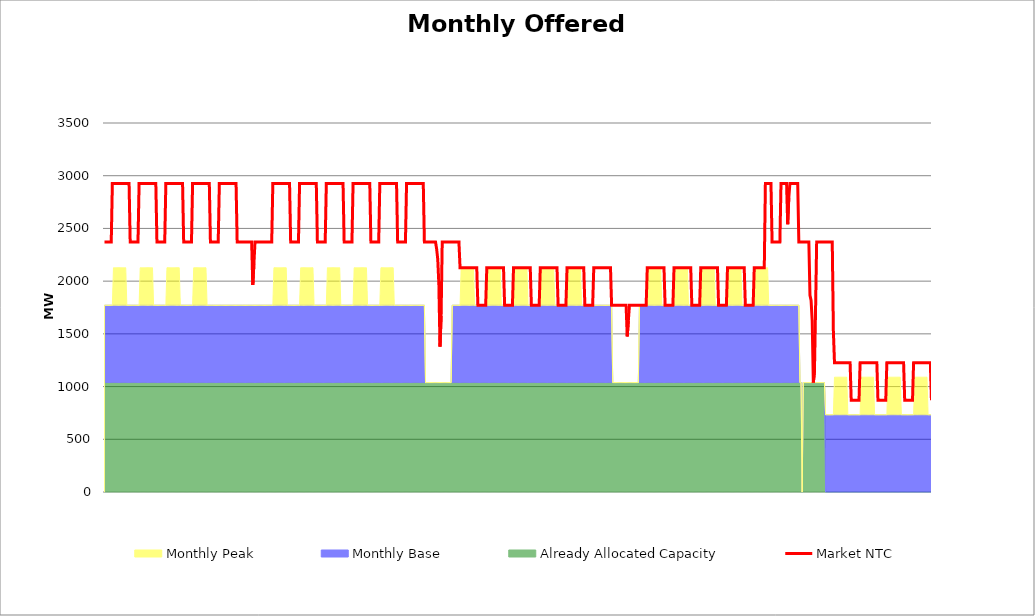
| Category | Market NTC |
|---|---|
| 0 | 2371 |
| 1 | 2371 |
| 2 | 2371 |
| 3 | 2371 |
| 4 | 2371 |
| 5 | 2371 |
| 6 | 2371 |
| 7 | 2927 |
| 8 | 2927 |
| 9 | 2927 |
| 10 | 2927 |
| 11 | 2927 |
| 12 | 2927 |
| 13 | 2927 |
| 14 | 2927 |
| 15 | 2927 |
| 16 | 2927 |
| 17 | 2927 |
| 18 | 2927 |
| 19 | 2927 |
| 20 | 2927 |
| 21 | 2927 |
| 22 | 2927 |
| 23 | 2371 |
| 24 | 2371 |
| 25 | 2371 |
| 26 | 2371 |
| 27 | 2371 |
| 28 | 2371 |
| 29 | 2371 |
| 30 | 2371 |
| 31 | 2927 |
| 32 | 2927 |
| 33 | 2927 |
| 34 | 2927 |
| 35 | 2927 |
| 36 | 2927 |
| 37 | 2927 |
| 38 | 2927 |
| 39 | 2927 |
| 40 | 2927 |
| 41 | 2927 |
| 42 | 2927 |
| 43 | 2927 |
| 44 | 2927 |
| 45 | 2927 |
| 46 | 2927 |
| 47 | 2371 |
| 48 | 2371 |
| 49 | 2371 |
| 50 | 2371 |
| 51 | 2371 |
| 52 | 2371 |
| 53 | 2371 |
| 54 | 2371 |
| 55 | 2927 |
| 56 | 2927 |
| 57 | 2927 |
| 58 | 2927 |
| 59 | 2927 |
| 60 | 2927 |
| 61 | 2927 |
| 62 | 2927 |
| 63 | 2927 |
| 64 | 2927 |
| 65 | 2927 |
| 66 | 2927 |
| 67 | 2927 |
| 68 | 2927 |
| 69 | 2927 |
| 70 | 2927 |
| 71 | 2371 |
| 72 | 2371 |
| 73 | 2371 |
| 74 | 2371 |
| 75 | 2371 |
| 76 | 2371 |
| 77 | 2371 |
| 78 | 2371 |
| 79 | 2927 |
| 80 | 2927 |
| 81 | 2927 |
| 82 | 2927 |
| 83 | 2927 |
| 84 | 2927 |
| 85 | 2927 |
| 86 | 2927 |
| 87 | 2927 |
| 88 | 2927 |
| 89 | 2927 |
| 90 | 2927 |
| 91 | 2927 |
| 92 | 2927 |
| 93 | 2927 |
| 94 | 2927 |
| 95 | 2371 |
| 96 | 2371 |
| 97 | 2371 |
| 98 | 2371 |
| 99 | 2371 |
| 100 | 2371 |
| 101 | 2371 |
| 102 | 2371 |
| 103 | 2927 |
| 104 | 2927 |
| 105 | 2927 |
| 106 | 2927 |
| 107 | 2927 |
| 108 | 2927 |
| 109 | 2927 |
| 110 | 2927 |
| 111 | 2927 |
| 112 | 2927 |
| 113 | 2927 |
| 114 | 2927 |
| 115 | 2927 |
| 116 | 2927 |
| 117 | 2927 |
| 118 | 2927 |
| 119 | 2371 |
| 120 | 2371 |
| 121 | 2371 |
| 122 | 2371 |
| 123 | 2371 |
| 124 | 2371 |
| 125 | 2371 |
| 126 | 2371 |
| 127 | 2371 |
| 128 | 2371 |
| 129 | 2371 |
| 130 | 2371 |
| 131 | 2371 |
| 132 | 2371 |
| 133 | 1963 |
| 134 | 2158 |
| 135 | 2371 |
| 136 | 2371 |
| 137 | 2371 |
| 138 | 2371 |
| 139 | 2371 |
| 140 | 2371 |
| 141 | 2371 |
| 142 | 2371 |
| 143 | 2371 |
| 144 | 2371 |
| 145 | 2371 |
| 146 | 2371 |
| 147 | 2371 |
| 148 | 2371 |
| 149 | 2371 |
| 150 | 2371 |
| 151 | 2927 |
| 152 | 2927 |
| 153 | 2927 |
| 154 | 2927 |
| 155 | 2927 |
| 156 | 2927 |
| 157 | 2927 |
| 158 | 2927 |
| 159 | 2927 |
| 160 | 2927 |
| 161 | 2927 |
| 162 | 2927 |
| 163 | 2927 |
| 164 | 2927 |
| 165 | 2927 |
| 166 | 2927 |
| 167 | 2371 |
| 168 | 2371 |
| 169 | 2371 |
| 170 | 2371 |
| 171 | 2371 |
| 172 | 2371 |
| 173 | 2371 |
| 174 | 2371 |
| 175 | 2927 |
| 176 | 2927 |
| 177 | 2927 |
| 178 | 2927 |
| 179 | 2927 |
| 180 | 2927 |
| 181 | 2927 |
| 182 | 2927 |
| 183 | 2927 |
| 184 | 2927 |
| 185 | 2927 |
| 186 | 2927 |
| 187 | 2927 |
| 188 | 2927 |
| 189 | 2927 |
| 190 | 2927 |
| 191 | 2371 |
| 192 | 2371 |
| 193 | 2371 |
| 194 | 2371 |
| 195 | 2371 |
| 196 | 2371 |
| 197 | 2371 |
| 198 | 2371 |
| 199 | 2927 |
| 200 | 2927 |
| 201 | 2927 |
| 202 | 2927 |
| 203 | 2927 |
| 204 | 2927 |
| 205 | 2927 |
| 206 | 2927 |
| 207 | 2927 |
| 208 | 2927 |
| 209 | 2927 |
| 210 | 2927 |
| 211 | 2927 |
| 212 | 2927 |
| 213 | 2927 |
| 214 | 2927 |
| 215 | 2371 |
| 216 | 2371 |
| 217 | 2371 |
| 218 | 2371 |
| 219 | 2371 |
| 220 | 2371 |
| 221 | 2371 |
| 222 | 2371 |
| 223 | 2927 |
| 224 | 2927 |
| 225 | 2927 |
| 226 | 2927 |
| 227 | 2927 |
| 228 | 2927 |
| 229 | 2927 |
| 230 | 2927 |
| 231 | 2927 |
| 232 | 2927 |
| 233 | 2927 |
| 234 | 2927 |
| 235 | 2927 |
| 236 | 2927 |
| 237 | 2927 |
| 238 | 2927 |
| 239 | 2371 |
| 240 | 2371 |
| 241 | 2371 |
| 242 | 2371 |
| 243 | 2371 |
| 244 | 2371 |
| 245 | 2371 |
| 246 | 2371 |
| 247 | 2927 |
| 248 | 2927 |
| 249 | 2927 |
| 250 | 2927 |
| 251 | 2927 |
| 252 | 2927 |
| 253 | 2927 |
| 254 | 2927 |
| 255 | 2927 |
| 256 | 2927 |
| 257 | 2927 |
| 258 | 2927 |
| 259 | 2927 |
| 260 | 2927 |
| 261 | 2927 |
| 262 | 2927 |
| 263 | 2371 |
| 264 | 2371 |
| 265 | 2371 |
| 266 | 2371 |
| 267 | 2371 |
| 268 | 2371 |
| 269 | 2371 |
| 270 | 2371 |
| 271 | 2927 |
| 272 | 2927 |
| 273 | 2927 |
| 274 | 2927 |
| 275 | 2927 |
| 276 | 2927 |
| 277 | 2927 |
| 278 | 2927 |
| 279 | 2927 |
| 280 | 2927 |
| 281 | 2927 |
| 282 | 2927 |
| 283 | 2927 |
| 284 | 2927 |
| 285 | 2927 |
| 286 | 2927 |
| 287 | 2371 |
| 288 | 2371 |
| 289 | 2371 |
| 290 | 2371 |
| 291 | 2371 |
| 292 | 2371 |
| 293 | 2371 |
| 294 | 2371 |
| 295 | 2371 |
| 296 | 2371 |
| 297 | 2371 |
| 298 | 2304 |
| 299 | 2207 |
| 300 | 1963 |
| 301 | 1379 |
| 302 | 1671 |
| 303 | 2371 |
| 304 | 2371 |
| 305 | 2371 |
| 306 | 2371 |
| 307 | 2371 |
| 308 | 2371 |
| 309 | 2371 |
| 310 | 2371 |
| 311 | 2371 |
| 312 | 2371 |
| 313 | 2371 |
| 314 | 2371 |
| 315 | 2371 |
| 316 | 2371 |
| 317 | 2371 |
| 318 | 2371 |
| 319 | 2127 |
| 320 | 2127 |
| 321 | 2127 |
| 322 | 2127 |
| 323 | 2127 |
| 324 | 2127 |
| 325 | 2127 |
| 326 | 2127 |
| 327 | 2127 |
| 328 | 2127 |
| 329 | 2127 |
| 330 | 2127 |
| 331 | 2127 |
| 332 | 2127 |
| 333 | 2127 |
| 334 | 2127 |
| 335 | 1771 |
| 336 | 1771 |
| 337 | 1771 |
| 338 | 1771 |
| 339 | 1771 |
| 340 | 1771 |
| 341 | 1771 |
| 342 | 1771 |
| 343 | 2127 |
| 344 | 2127 |
| 345 | 2127 |
| 346 | 2127 |
| 347 | 2127 |
| 348 | 2127 |
| 349 | 2127 |
| 350 | 2127 |
| 351 | 2127 |
| 352 | 2127 |
| 353 | 2127 |
| 354 | 2127 |
| 355 | 2127 |
| 356 | 2127 |
| 357 | 2127 |
| 358 | 2127 |
| 359 | 1771 |
| 360 | 1771 |
| 361 | 1771 |
| 362 | 1771 |
| 363 | 1771 |
| 364 | 1771 |
| 365 | 1771 |
| 366 | 1771 |
| 367 | 2127 |
| 368 | 2127 |
| 369 | 2127 |
| 370 | 2127 |
| 371 | 2127 |
| 372 | 2127 |
| 373 | 2127 |
| 374 | 2127 |
| 375 | 2127 |
| 376 | 2127 |
| 377 | 2127 |
| 378 | 2127 |
| 379 | 2127 |
| 380 | 2127 |
| 381 | 2127 |
| 382 | 2127 |
| 383 | 1771 |
| 384 | 1771 |
| 385 | 1771 |
| 386 | 1771 |
| 387 | 1771 |
| 388 | 1771 |
| 389 | 1771 |
| 390 | 1771 |
| 391 | 2127 |
| 392 | 2127 |
| 393 | 2127 |
| 394 | 2127 |
| 395 | 2127 |
| 396 | 2127 |
| 397 | 2127 |
| 398 | 2127 |
| 399 | 2127 |
| 400 | 2127 |
| 401 | 2127 |
| 402 | 2127 |
| 403 | 2127 |
| 404 | 2127 |
| 405 | 2127 |
| 406 | 2127 |
| 407 | 1771 |
| 408 | 1771 |
| 409 | 1771 |
| 410 | 1771 |
| 411 | 1771 |
| 412 | 1771 |
| 413 | 1771 |
| 414 | 1771 |
| 415 | 2127 |
| 416 | 2127 |
| 417 | 2127 |
| 418 | 2127 |
| 419 | 2127 |
| 420 | 2127 |
| 421 | 2127 |
| 422 | 2127 |
| 423 | 2127 |
| 424 | 2127 |
| 425 | 2127 |
| 426 | 2127 |
| 427 | 2127 |
| 428 | 2127 |
| 429 | 2127 |
| 430 | 2127 |
| 431 | 1771 |
| 432 | 1771 |
| 433 | 1771 |
| 434 | 1771 |
| 435 | 1771 |
| 436 | 1771 |
| 437 | 1771 |
| 438 | 1771 |
| 439 | 2127 |
| 440 | 2127 |
| 441 | 2127 |
| 442 | 2127 |
| 443 | 2127 |
| 444 | 2127 |
| 445 | 2127 |
| 446 | 2127 |
| 447 | 2127 |
| 448 | 2127 |
| 449 | 2127 |
| 450 | 2127 |
| 451 | 2127 |
| 452 | 2127 |
| 453 | 2127 |
| 454 | 2127 |
| 455 | 1771 |
| 456 | 1771 |
| 457 | 1771 |
| 458 | 1771 |
| 459 | 1771 |
| 460 | 1771 |
| 461 | 1771 |
| 462 | 1771 |
| 463 | 1771 |
| 464 | 1771 |
| 465 | 1771 |
| 466 | 1771 |
| 467 | 1771 |
| 468 | 1771 |
| 469 | 1476 |
| 470 | 1623 |
| 471 | 1771 |
| 472 | 1771 |
| 473 | 1771 |
| 474 | 1771 |
| 475 | 1771 |
| 476 | 1771 |
| 477 | 1771 |
| 478 | 1771 |
| 479 | 1771 |
| 480 | 1771 |
| 481 | 1771 |
| 482 | 1771 |
| 483 | 1771 |
| 484 | 1771 |
| 485 | 1771 |
| 486 | 1771 |
| 487 | 2127 |
| 488 | 2127 |
| 489 | 2127 |
| 490 | 2127 |
| 491 | 2127 |
| 492 | 2127 |
| 493 | 2127 |
| 494 | 2127 |
| 495 | 2127 |
| 496 | 2127 |
| 497 | 2127 |
| 498 | 2127 |
| 499 | 2127 |
| 500 | 2127 |
| 501 | 2127 |
| 502 | 2127 |
| 503 | 1771 |
| 504 | 1771 |
| 505 | 1771 |
| 506 | 1771 |
| 507 | 1771 |
| 508 | 1771 |
| 509 | 1771 |
| 510 | 1771 |
| 511 | 2127 |
| 512 | 2127 |
| 513 | 2127 |
| 514 | 2127 |
| 515 | 2127 |
| 516 | 2127 |
| 517 | 2127 |
| 518 | 2127 |
| 519 | 2127 |
| 520 | 2127 |
| 521 | 2127 |
| 522 | 2127 |
| 523 | 2127 |
| 524 | 2127 |
| 525 | 2127 |
| 526 | 2127 |
| 527 | 1771 |
| 528 | 1771 |
| 529 | 1771 |
| 530 | 1771 |
| 531 | 1771 |
| 532 | 1771 |
| 533 | 1771 |
| 534 | 1771 |
| 535 | 2127 |
| 536 | 2127 |
| 537 | 2127 |
| 538 | 2127 |
| 539 | 2127 |
| 540 | 2127 |
| 541 | 2127 |
| 542 | 2127 |
| 543 | 2127 |
| 544 | 2127 |
| 545 | 2127 |
| 546 | 2127 |
| 547 | 2127 |
| 548 | 2127 |
| 549 | 2127 |
| 550 | 2127 |
| 551 | 1771 |
| 552 | 1771 |
| 553 | 1771 |
| 554 | 1771 |
| 555 | 1771 |
| 556 | 1771 |
| 557 | 1771 |
| 558 | 1771 |
| 559 | 2127 |
| 560 | 2127 |
| 561 | 2127 |
| 562 | 2127 |
| 563 | 2127 |
| 564 | 2127 |
| 565 | 2127 |
| 566 | 2127 |
| 567 | 2127 |
| 568 | 2127 |
| 569 | 2127 |
| 570 | 2127 |
| 571 | 2127 |
| 572 | 2127 |
| 573 | 2127 |
| 574 | 2127 |
| 575 | 1771 |
| 576 | 1771 |
| 577 | 1771 |
| 578 | 1771 |
| 579 | 1771 |
| 580 | 1771 |
| 581 | 1771 |
| 582 | 1771 |
| 583 | 2127 |
| 584 | 2127 |
| 585 | 2127 |
| 586 | 2127 |
| 587 | 2127 |
| 588 | 2127 |
| 589 | 2127 |
| 590 | 2127 |
| 591 | 2127 |
| 592 | 2127 |
| 593 | 2927 |
| 594 | 2927 |
| 595 | 2927 |
| 596 | 2927 |
| 597 | 2927 |
| 598 | 2927 |
| 599 | 2371 |
| 600 | 2371 |
| 601 | 2371 |
| 602 | 2371 |
| 603 | 2371 |
| 604 | 2371 |
| 605 | 2371 |
| 606 | 2371 |
| 607 | 2927 |
| 608 | 2927 |
| 609 | 2927 |
| 610 | 2927 |
| 611 | 2927 |
| 612 | 2927 |
| 613 | 2540 |
| 614 | 2792 |
| 615 | 2927 |
| 616 | 2927 |
| 617 | 2927 |
| 618 | 2927 |
| 619 | 2927 |
| 620 | 2927 |
| 621 | 2927 |
| 622 | 2927 |
| 623 | 2371 |
| 624 | 2371 |
| 625 | 2371 |
| 626 | 2371 |
| 627 | 2371 |
| 628 | 2371 |
| 629 | 2371 |
| 630 | 2371 |
| 631 | 2371 |
| 632 | 2371 |
| 633 | 1866 |
| 634 | 1817 |
| 635 | 1623 |
| 636 | 1038 |
| 637 | 1136 |
| 638 | 1720 |
| 639 | 2371 |
| 640 | 2371 |
| 641 | 2371 |
| 642 | 2371 |
| 643 | 2371 |
| 644 | 2371 |
| 645 | 2371 |
| 646 | 2371 |
| 647 | 2371 |
| 648 | 2371 |
| 649 | 2371 |
| 650 | 2371 |
| 651 | 2371 |
| 652 | 2371 |
| 653 | 2371 |
| 654 | 1527 |
| 655 | 1227 |
| 656 | 1227 |
| 657 | 1227 |
| 658 | 1227 |
| 659 | 1227 |
| 660 | 1227 |
| 661 | 1227 |
| 662 | 1227 |
| 663 | 1227 |
| 664 | 1227 |
| 665 | 1227 |
| 666 | 1227 |
| 667 | 1227 |
| 668 | 1227 |
| 669 | 1227 |
| 670 | 871 |
| 671 | 871 |
| 672 | 871 |
| 673 | 871 |
| 674 | 871 |
| 675 | 871 |
| 676 | 871 |
| 677 | 871 |
| 678 | 1227 |
| 679 | 1227 |
| 680 | 1227 |
| 681 | 1227 |
| 682 | 1227 |
| 683 | 1227 |
| 684 | 1227 |
| 685 | 1227 |
| 686 | 1227 |
| 687 | 1227 |
| 688 | 1227 |
| 689 | 1227 |
| 690 | 1227 |
| 691 | 1227 |
| 692 | 1227 |
| 693 | 1227 |
| 694 | 871 |
| 695 | 871 |
| 696 | 871 |
| 697 | 871 |
| 698 | 871 |
| 699 | 871 |
| 700 | 871 |
| 701 | 871 |
| 702 | 1227 |
| 703 | 1227 |
| 704 | 1227 |
| 705 | 1227 |
| 706 | 1227 |
| 707 | 1227 |
| 708 | 1227 |
| 709 | 1227 |
| 710 | 1227 |
| 711 | 1227 |
| 712 | 1227 |
| 713 | 1227 |
| 714 | 1227 |
| 715 | 1227 |
| 716 | 1227 |
| 717 | 1227 |
| 718 | 871 |
| 719 | 871 |
| 720 | 871 |
| 721 | 871 |
| 722 | 871 |
| 723 | 871 |
| 724 | 871 |
| 725 | 871 |
| 726 | 1227 |
| 727 | 1227 |
| 728 | 1227 |
| 729 | 1227 |
| 730 | 1227 |
| 731 | 1227 |
| 732 | 1227 |
| 733 | 1227 |
| 734 | 1227 |
| 735 | 1227 |
| 736 | 1227 |
| 737 | 1227 |
| 738 | 1227 |
| 739 | 1227 |
| 740 | 1227 |
| 741 | 1227 |
| 742 | 871 |